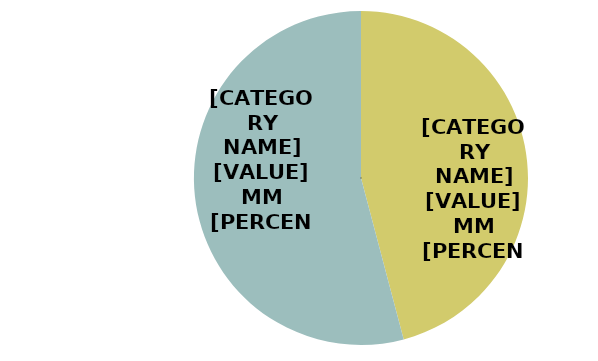
| Category | Series 0 |
|---|---|
| SLICED | 51.436 |
| WHOLE | 60.666 |